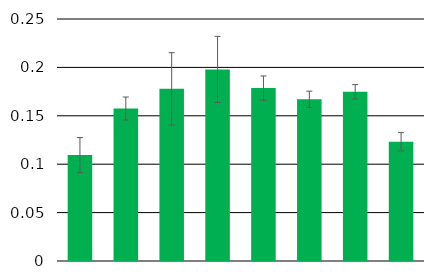
| Category | Series 0 |
|---|---|
| 0 | 0.11 |
| 1 | 0.158 |
| 2 | 0.178 |
| 3 | 0.198 |
| 4 | 0.179 |
| 5 | 0.167 |
| 6 | 0.175 |
| 7 | 0.123 |